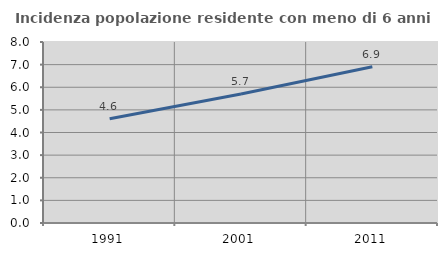
| Category | Incidenza popolazione residente con meno di 6 anni |
|---|---|
| 1991.0 | 4.608 |
| 2001.0 | 5.703 |
| 2011.0 | 6.902 |